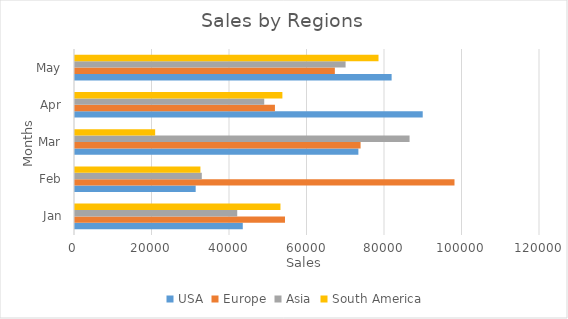
| Category | USA | Europe | Asia | South America |
|---|---|---|---|---|
| Jan | 43299 | 54193 | 41864 | 53022 |
| Feb | 31142 | 97933 | 32721 | 32366 |
| Mar | 73130 | 73698 | 86341 | 20689 |
| Apr | 89734 | 51598 | 48832 | 53519 |
| May | 81709 | 67057 | 69829 | 78326 |